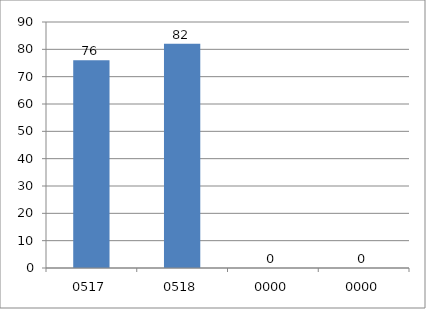
| Category | Series 0 |
|---|---|
| 517.0 | 76 |
| 518.0 | 82 |
| 0.0 | 0 |
| 0.0 | 0 |